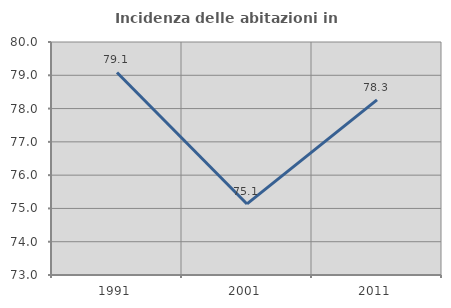
| Category | Incidenza delle abitazioni in proprietà  |
|---|---|
| 1991.0 | 79.085 |
| 2001.0 | 75.135 |
| 2011.0 | 78.261 |